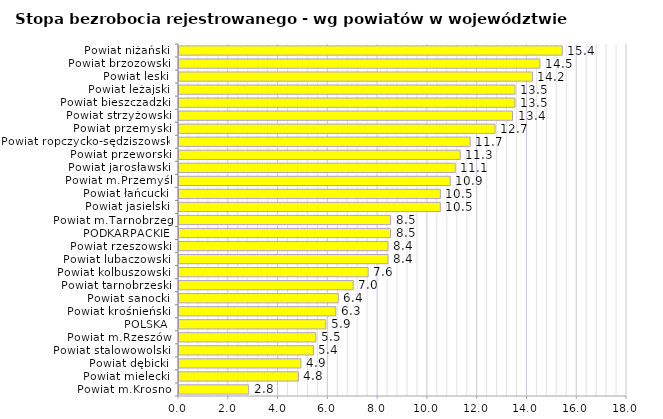
| Category | Stopa bezrobocia rejestrowanego - wg powiatów w województwie podkarpackim |
|---|---|
| Powiat m.Krosno | 2.8 |
| Powiat mielecki | 4.8 |
| Powiat dębicki | 4.9 |
| Powiat stalowowolski | 5.4 |
| Powiat m.Rzeszów | 5.5 |
| POLSKA | 5.9 |
| Powiat krośnieński | 6.3 |
| Powiat sanocki | 6.4 |
| Powiat tarnobrzeski | 7 |
| Powiat kolbuszowski | 7.6 |
| Powiat lubaczowski | 8.4 |
| Powiat rzeszowski | 8.4 |
| PODKARPACKIE | 8.5 |
| Powiat m.Tarnobrzeg | 8.5 |
| Powiat jasielski | 10.5 |
| Powiat łańcucki | 10.5 |
| Powiat m.Przemyśl | 10.9 |
| Powiat jarosławski | 11.1 |
| Powiat przeworski | 11.3 |
| Powiat ropczycko-sędziszowski | 11.7 |
| Powiat przemyski | 12.7 |
| Powiat strzyżowski | 13.4 |
| Powiat bieszczadzki | 13.5 |
| Powiat leżajski | 13.5 |
| Powiat leski | 14.2 |
| Powiat brzozowski | 14.5 |
| Powiat niżański | 15.4 |